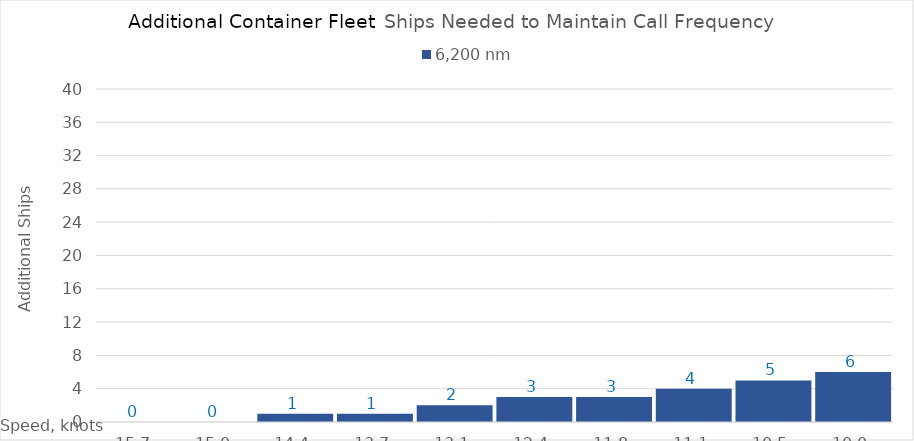
| Category | 6,200 |
|---|---|
| 15.65 | 0 |
| 15.0 | 0 |
| 14.35 | 1 |
| 13.7 | 1 |
| 13.049999999999999 | 2 |
| 12.399999999999999 | 3 |
| 11.749999999999998 | 3 |
| 11.099999999999998 | 4 |
| 10.449999999999998 | 5 |
| 10.0 | 6 |